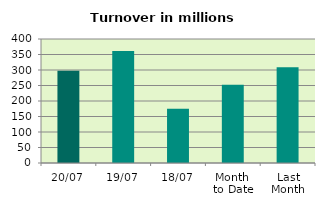
| Category | Series 0 |
|---|---|
| 20/07 | 297.721 |
| 19/07 | 361.299 |
| 18/07 | 174.938 |
| Month 
to Date | 252.129 |
| Last
Month | 308.534 |